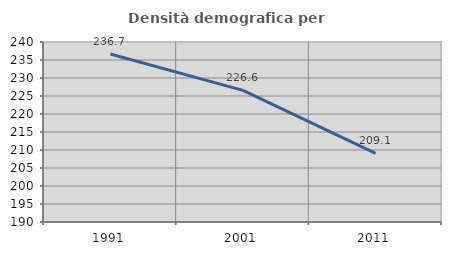
| Category | Densità demografica |
|---|---|
| 1991.0 | 236.671 |
| 2001.0 | 226.572 |
| 2011.0 | 209.08 |